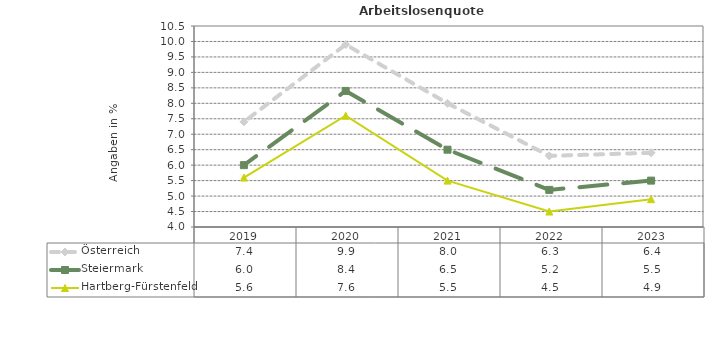
| Category | Österreich | Steiermark | Hartberg-Fürstenfeld |
|---|---|---|---|
| 2023.0 | 6.4 | 5.5 | 4.9 |
| 2022.0 | 6.3 | 5.2 | 4.5 |
| 2021.0 | 8 | 6.5 | 5.5 |
| 2020.0 | 9.9 | 8.4 | 7.6 |
| 2019.0 | 7.4 | 6 | 5.6 |